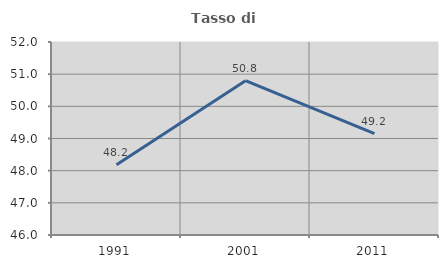
| Category | Tasso di occupazione   |
|---|---|
| 1991.0 | 48.184 |
| 2001.0 | 50.796 |
| 2011.0 | 49.15 |